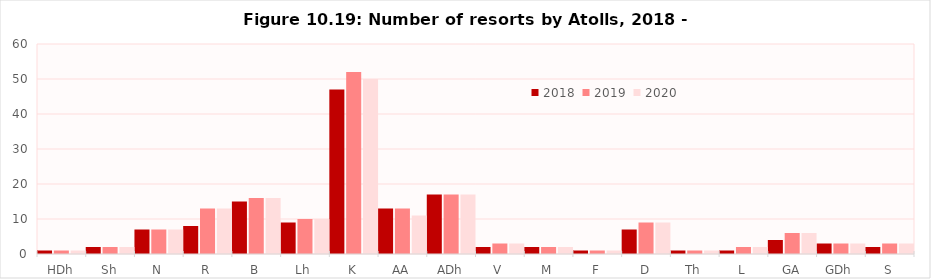
| Category | 2018 | 2019 | 2020 |
|---|---|---|---|
| HDh | 1 | 1 | 1 |
| Sh | 2 | 2 | 2 |
| N | 7 | 7 | 7 |
| R | 8 | 13 | 13 |
| B | 15 | 16 | 16 |
| Lh | 9 | 10 | 10 |
| K | 47 | 52 | 50 |
| AA | 13 | 13 | 11 |
| ADh | 17 | 17 | 17 |
| V | 2 | 3 | 3 |
| M | 2 | 2 | 2 |
| F | 1 | 1 | 1 |
| D | 7 | 9 | 9 |
| Th | 1 | 1 | 1 |
| L | 1 | 2 | 2 |
| GA | 4 | 6 | 6 |
| GDh | 3 | 3 | 3 |
| S | 2 | 3 | 3 |